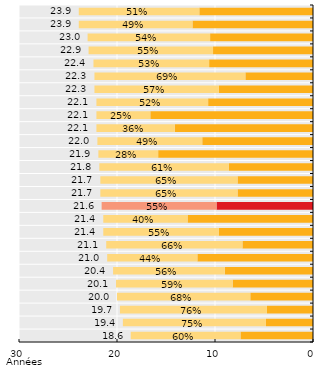
| Category | Années de vie en bonne santé | Espérance de vie avec limitation de l'activité | Series 0 |
|---|---|---|---|
| 0.5146443514644351 | 11.6 | 12.3 | 23.9 |
| 0.4853556485355648 | 12.3 | 11.6 | 23.9 |
| 0.5434782608695652 | 10.5 | 12.5 | 23 |
| 0.5545851528384279 | 10.2 | 12.7 | 22.9 |
| 0.5267857142857143 | 10.6 | 11.8 | 22.4 |
| 0.6905829596412556 | 6.9 | 15.4 | 22.3 |
| 0.5695067264573991 | 9.6 | 12.7 | 22.3 |
| 0.5158371040723982 | 10.7 | 11.4 | 22.1 |
| 0.24886877828054296 | 16.6 | 5.5 | 22.1 |
| 0.3619909502262444 | 14.1 | 8 | 22.1 |
| 0.48636363636363633 | 11.3 | 10.7 | 22 |
| 0.27853881278538806 | 15.8 | 6.1 | 21.9 |
| 0.6055045871559633 | 8.6 | 13.2 | 21.8 |
| 0.6451612903225806 | 7.7 | 14 | 21.7 |
| 0.6451612903225806 | 7.7 | 14 | 21.7 |
| 0.5467804723876779 | 9.844 | 11.724 | 21.568 |
| 0.4018691588785046 | 12.8 | 8.6 | 21.4 |
| 0.5514018691588785 | 9.6 | 11.8 | 21.4 |
| 0.6587677725118484 | 7.2 | 13.9 | 21.1 |
| 0.43809523809523804 | 11.8 | 9.2 | 21 |
| 0.5588235294117647 | 9 | 11.4 | 20.4 |
| 0.592039800995025 | 8.2 | 11.9 | 20.1 |
| 0.6799999999999999 | 6.4 | 13.6 | 20 |
| 0.7614213197969544 | 4.7 | 15 | 19.7 |
| 0.7525773195876289 | 4.8 | 14.6 | 19.4 |
| 0.6021505376344086 | 7.4 | 11.2 | 18.6 |